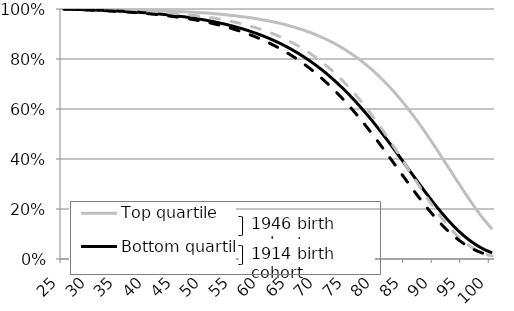
| Category | Top quartile | Bottom quartile |
|---|---|---|
| 25.0 | 1 | 0.999 |
| 26.0 | 0.999 | 0.999 |
| 27.0 | 0.999 | 0.998 |
| 28.0 | 0.999 | 0.997 |
| 29.0 | 0.998 | 0.996 |
| 30.0 | 0.998 | 0.995 |
| 31.0 | 0.997 | 0.994 |
| 32.0 | 0.997 | 0.993 |
| 33.0 | 0.996 | 0.992 |
| 34.0 | 0.995 | 0.991 |
| 35.0 | 0.994 | 0.99 |
| 36.0 | 0.994 | 0.988 |
| 37.0 | 0.993 | 0.986 |
| 38.0 | 0.992 | 0.985 |
| 39.0 | 0.99 | 0.983 |
| 40.0 | 0.989 | 0.981 |
| 41.0 | 0.988 | 0.978 |
| 42.0 | 0.986 | 0.976 |
| 43.0 | 0.985 | 0.973 |
| 44.0 | 0.983 | 0.97 |
| 45.0 | 0.981 | 0.967 |
| 46.0 | 0.979 | 0.964 |
| 47.0 | 0.976 | 0.96 |
| 48.0 | 0.974 | 0.956 |
| 49.0 | 0.971 | 0.952 |
| 50.0 | 0.968 | 0.947 |
| 51.0 | 0.964 | 0.942 |
| 52.0 | 0.961 | 0.937 |
| 53.0 | 0.957 | 0.931 |
| 54.0 | 0.952 | 0.925 |
| 55.0 | 0.947 | 0.918 |
| 56.0 | 0.942 | 0.91 |
| 57.0 | 0.936 | 0.902 |
| 58.0 | 0.929 | 0.894 |
| 59.0 | 0.922 | 0.884 |
| 60.0 | 0.915 | 0.874 |
| 61.0 | 0.907 | 0.864 |
| 62.0 | 0.897 | 0.852 |
| 63.0 | 0.888 | 0.84 |
| 64.0 | 0.877 | 0.826 |
| 65.0 | 0.865 | 0.812 |
| 66.0 | 0.853 | 0.797 |
| 67.0 | 0.839 | 0.781 |
| 68.0 | 0.824 | 0.764 |
| 69.0 | 0.808 | 0.745 |
| 70.0 | 0.791 | 0.726 |
| 71.0 | 0.773 | 0.705 |
| 72.0 | 0.753 | 0.684 |
| 73.0 | 0.732 | 0.661 |
| 74.0 | 0.709 | 0.637 |
| 75.0 | 0.685 | 0.611 |
| 76.0 | 0.659 | 0.585 |
| 77.0 | 0.632 | 0.558 |
| 78.0 | 0.604 | 0.529 |
| 79.0 | 0.574 | 0.5 |
| 80.0 | 0.542 | 0.47 |
| 81.0 | 0.51 | 0.439 |
| 82.0 | 0.476 | 0.408 |
| 83.0 | 0.442 | 0.376 |
| 84.0 | 0.407 | 0.345 |
| 85.0 | 0.371 | 0.313 |
| 86.0 | 0.335 | 0.282 |
| 87.0 | 0.3 | 0.252 |
| 88.0 | 0.265 | 0.222 |
| 89.0 | 0.231 | 0.194 |
| 90.0 | 0.199 | 0.167 |
| 91.0 | 0.168 | 0.142 |
| 92.0 | 0.14 | 0.118 |
| 93.0 | 0.114 | 0.097 |
| 94.0 | 0.091 | 0.078 |
| 95.0 | 0.07 | 0.062 |
| 96.0 | 0.053 | 0.048 |
| 97.0 | 0.039 | 0.036 |
| 98.0 | 0.027 | 0.026 |
| 99.0 | 0.018 | 0.018 |
| 100.0 | 0.012 | 0.012 |